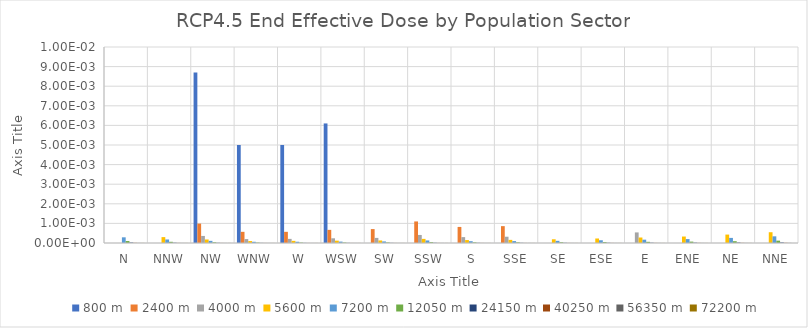
| Category | 800 m | 2400 m | 4000 m | 5600 m | 7200 m | 12050 m | 24150 m | 40250 m | 56350 m | 72200 m |
|---|---|---|---|---|---|---|---|---|---|---|
| N | 0 | 0 | 0 | 0 | 0 | 0 | 0 | 0 | 0 | 0 |
| NNW | 0 | 0 | 0 | 0 | 0 | 0 | 0 | 0 | 0 | 0 |
| NW | 0.009 | 0.001 | 0 | 0 | 0 | 0 | 0 | 0 | 0 | 0 |
| WNW | 0.005 | 0.001 | 0 | 0 | 0 | 0 | 0 | 0 | 0 | 0 |
| W | 0.005 | 0.001 | 0 | 0 | 0 | 0 | 0 | 0 | 0 | 0 |
| WSW | 0.006 | 0.001 | 0 | 0 | 0 | 0 | 0 | 0 | 0 | 0 |
| SW | 0 | 0.001 | 0 | 0 | 0 | 0 | 0 | 0 | 0 | 0 |
| SSW | 0 | 0.001 | 0 | 0 | 0 | 0 | 0 | 0 | 0 | 0 |
| S | 0 | 0.001 | 0 | 0 | 0 | 0 | 0 | 0 | 0 | 0 |
| SSE | 0 | 0.001 | 0 | 0 | 0 | 0 | 0 | 0 | 0 | 0 |
| SE | 0 | 0 | 0 | 0 | 0 | 0 | 0 | 0 | 0 | 0 |
| ESE | 0 | 0 | 0 | 0 | 0 | 0 | 0 | 0 | 0 | 0 |
| E | 0 | 0 | 0.001 | 0 | 0 | 0 | 0 | 0 | 0 | 0 |
| ENE | 0 | 0 | 0 | 0 | 0 | 0 | 0 | 0 | 0 | 0 |
| NE | 0 | 0 | 0 | 0 | 0 | 0 | 0 | 0 | 0 | 0 |
| NNE | 0 | 0 | 0 | 0.001 | 0 | 0 | 0 | 0 | 0 | 0 |